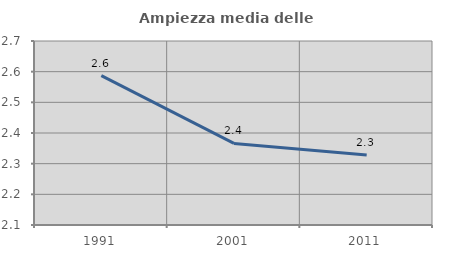
| Category | Ampiezza media delle famiglie |
|---|---|
| 1991.0 | 2.587 |
| 2001.0 | 2.366 |
| 2011.0 | 2.328 |